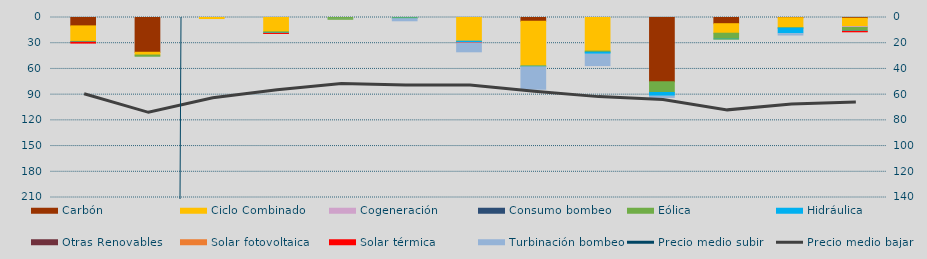
| Category | Carbón | Ciclo Combinado | Cogeneración | Consumo bombeo | Eólica | Hidráulica | Otras Renovables | Solar fotovoltaica | Solar térmica | Turbinación bombeo |
|---|---|---|---|---|---|---|---|---|---|---|
| 0 | 9798 | 18106.5 | 0 |  | 568.3 | 428.4 |  | 0 | 944 | 0 |
| 1 | 40570 | 3247 | 0 |  | 1377.6 | 0 |  | 0 | 0 | 0 |
| 2 | 0 | 1230 | 0 |  | 0 | 0 |  | 0 | 0 | 0 |
| 3 | 0 | 16736 | 0 |  | 1262.8 | 563.7 |  | 25.9 | 0.7 | 0 |
| 4 | 0 | 0 | 0 |  | 2064.3 | 0 |  | 0 | 0 | 200 |
| 5 | 0 | 0 | 0 |  | 855.2 | 637 |  | 0 | 0 | 3504.5 |
| 6 | 0 | 27663.3 | 74 |  | 18.7 | 1645.3 |  | 8 | 221.4 | 11565.1 |
| 7 | 4460 | 52106 | 0 |  | 368.1 | 764.8 |  | 0 | 0 | 27154.6 |
| 8 | 0 | 39236 | 0 |  | 1278 | 2424.3 |  | 0 | 0 | 14379.6 |
| 9 | 74968 | 0 | 0 |  | 12523.3 | 4431 |  | 0 | 0 | 2491.6 |
| 10 | 7230 | 11115 | 0 |  | 6943.7 | 542.5 |  | 0 | 0 | 0 |
| 11 | 225 | 11910 | 0 |  | 141.3 | 6802.6 |  | 0 | 0 | 2517.5 |
| 12 | 872 | 9746.8 | 968.1 |  | 3997.8 | 598.2 |  | 46.7 | 458.7 | 0 |